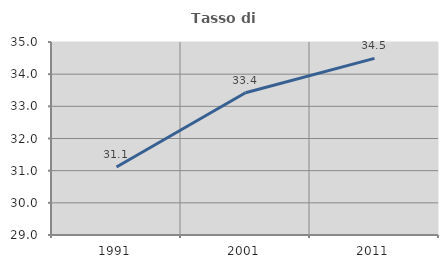
| Category | Tasso di occupazione   |
|---|---|
| 1991.0 | 31.112 |
| 2001.0 | 33.424 |
| 2011.0 | 34.492 |